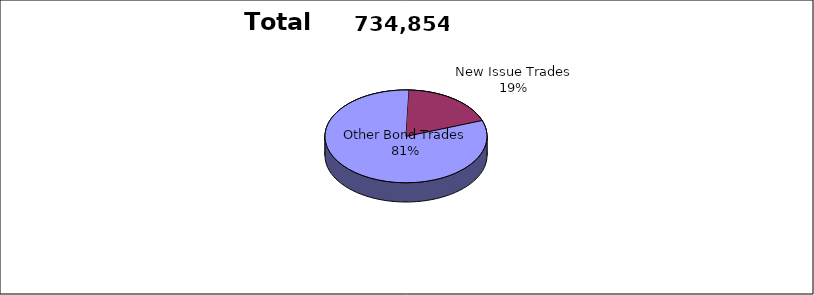
| Category | Series 0 |
|---|---|
| Other Bond Trades | 596303 |
| New Issue Trades | 138551 |